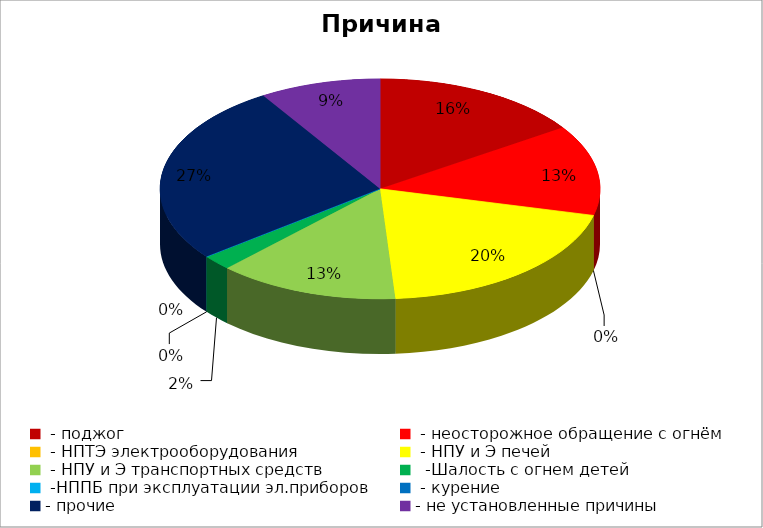
| Category | Причина пожара |
|---|---|
|  - поджог | 7 |
|  - неосторожное обращение с огнём | 6 |
|  - НПТЭ электрооборудования | 0 |
|  - НПУ и Э печей | 9 |
|  - НПУ и Э транспортных средств | 6 |
|   -Шалость с огнем детей | 1 |
|  -НППБ при эксплуатации эл.приборов | 0 |
|  - курение | 0 |
| - прочие | 12 |
| - не установленные причины | 4 |